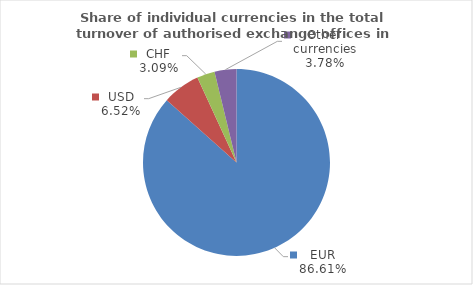
| Category | Series 0 |
|---|---|
| EUR | 86.613 |
| USD | 6.521 |
| CHF | 3.083 |
| Other currencies | 3.783 |